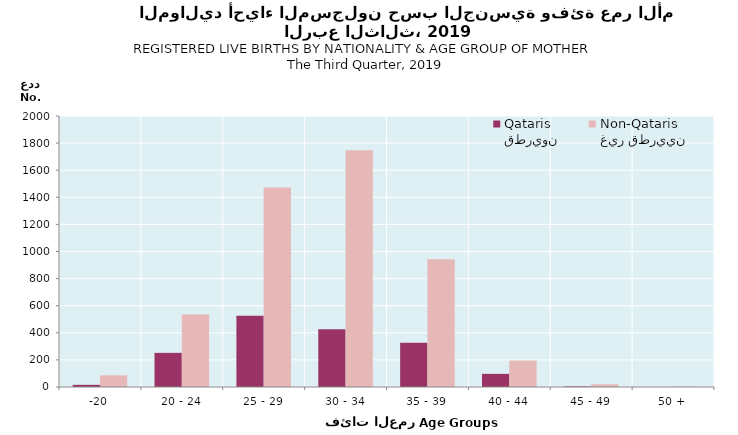
| Category | قطريون
Qataris | غير قطريين
Non-Qataris |
|---|---|---|
| -20 | 16 | 86 |
| 20 - 24 | 252 | 535 |
| 25 - 29 | 525 | 1472 |
| 30 - 34 | 426 | 1748 |
| 35 - 39 | 326 | 943 |
| 40 - 44 | 97 | 195 |
| 45 - 49 | 4 | 20 |
| 50 + | 0 | 2 |